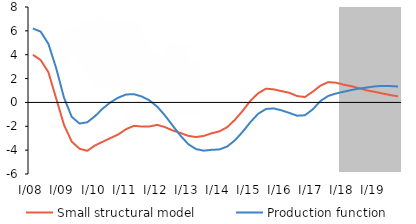
| Category | Small structural model | Production function |
|---|---|---|
| I/08 | 3.997 | 6.2 |
| II | 3.554 | 5.936 |
| III | 2.528 | 4.91 |
| IV | 0.326 | 2.868 |
| I/09 | -1.875 | 0.403 |
| II | -3.286 | -1.209 |
| III | -3.883 | -1.771 |
| IV | -4.055 | -1.662 |
| I/10 | -3.604 | -1.145 |
| II | -3.29 | -0.507 |
| III | -2.984 | 0.013 |
| IV | -2.68 | 0.404 |
| I/11 | -2.238 | 0.666 |
| II | -1.964 | 0.692 |
| III | -2.017 | 0.5 |
| IV | -2.016 | 0.173 |
| I/12 | -1.881 | -0.355 |
| II | -2.07 | -1.095 |
| III | -2.352 | -1.951 |
| IV | -2.565 | -2.79 |
| I/13 | -2.805 | -3.501 |
| II | -2.901 | -3.912 |
| III | -2.806 | -4.044 |
| IV | -2.589 | -3.973 |
| I/14 | -2.424 | -3.943 |
| II | -2.077 | -3.697 |
| III | -1.455 | -3.177 |
| IV | -0.7 | -2.459 |
| I/15 | 0.143 | -1.647 |
| II | 0.773 | -0.947 |
| III | 1.155 | -0.548 |
| IV | 1.093 | -0.505 |
| I/16 | 0.947 | -0.665 |
| II | 0.809 | -0.882 |
| III | 0.536 | -1.11 |
| IV | 0.453 | -1.078 |
| I/17 | 0.893 | -0.592 |
| II | 1.401 | 0.119 |
| III | 1.702 | 0.541 |
| IV | 1.656 | 0.748 |
| I/18 | 1.487 | 0.896 |
| II | 1.357 | 1.042 |
| III | 1.19 | 1.161 |
| IV | 1.005 | 1.252 |
| I/19 | 0.891 | 1.343 |
| II | 0.747 | 1.388 |
| III | 0.621 | 1.371 |
| IV | 0.506 | 1.338 |